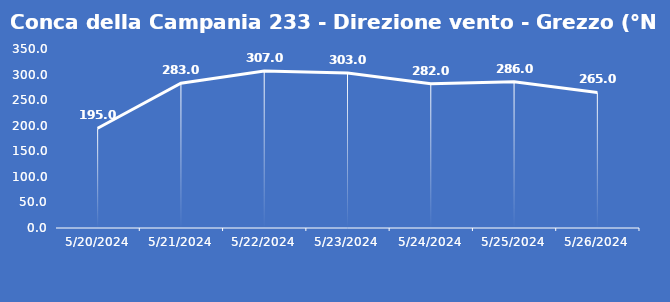
| Category | Conca della Campania 233 - Direzione vento - Grezzo (°N) |
|---|---|
| 5/20/24 | 195 |
| 5/21/24 | 283 |
| 5/22/24 | 307 |
| 5/23/24 | 303 |
| 5/24/24 | 282 |
| 5/25/24 | 286 |
| 5/26/24 | 265 |